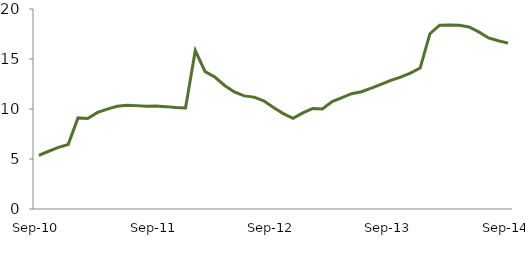
| Category | Series 0 |
|---|---|
| Sep-10 | 5.365 |
|  | 5.775 |
|  | 6.16 |
|  | 6.454 |
|  | 9.112 |
|  | 9.055 |
|  | 9.664 |
|  | 9.991 |
|  | 10.267 |
|  | 10.363 |
|  | 10.338 |
|  | 10.273 |
| Sep-11 | 10.288 |
|  | 10.237 |
|  | 10.151 |
|  | 10.1 |
|  | 15.839 |
|  | 13.738 |
|  | 13.199 |
|  | 12.351 |
|  | 11.706 |
|  | 11.314 |
|  | 11.188 |
|  | 10.816 |
| Sep-12 | 10.141 |
|  | 9.544 |
|  | 9.067 |
|  | 9.616 |
|  | 10.045 |
|  | 10.013 |
|  | 10.751 |
|  | 11.131 |
|  | 11.532 |
|  | 11.724 |
|  | 12.082 |
|  | 12.472 |
| Sep-13 | 12.86 |
|  | 13.193 |
|  | 13.59 |
|  | 14.096 |
|  | 17.526 |
|  | 18.377 |
|  | 18.389 |
|  | 18.378 |
|  | 18.197 |
|  | 17.708 |
|  | 17.106 |
|  | 16.821 |
| Sep-14 | 16.591 |